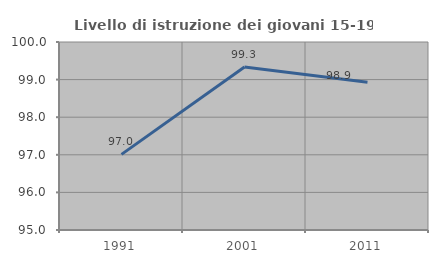
| Category | Livello di istruzione dei giovani 15-19 anni |
|---|---|
| 1991.0 | 97.012 |
| 2001.0 | 99.333 |
| 2011.0 | 98.932 |